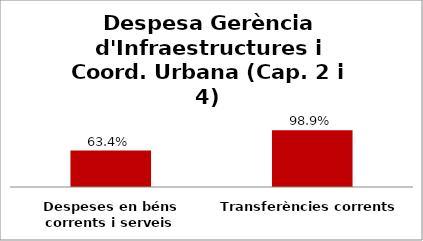
| Category | Series 0 |
|---|---|
| Despeses en béns corrents i serveis | 0.634 |
| Transferències corrents | 0.989 |